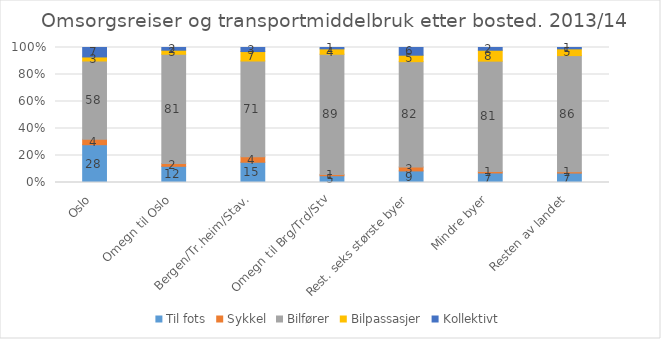
| Category | Til fots | Sykkel | Bilfører | Bilpassasjer | Kollektivt |
|---|---|---|---|---|---|
| Oslo | 28 | 4 | 58 | 3 | 7 |
| Omegn til Oslo | 12 | 2 | 81 | 3 | 2 |
| Bergen/Tr.heim/Stav. | 15 | 4 | 71 | 7 | 3 |
| Omegn til Brg/Trd/Stv | 5 | 1 | 89 | 4 | 1 |
| Rest. seks største byer | 9 | 3 | 82 | 5 | 6 |
| Mindre byer | 7 | 1 | 81 | 8 | 2 |
| Resten av landet | 7 | 1 | 86 | 5 | 1 |